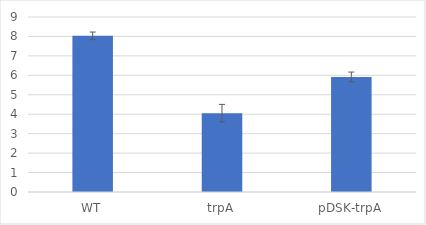
| Category | Series 0 |
|---|---|
| WT | 8.03 |
| trpA | 4.053 |
| pDSK-trpA | 5.919 |